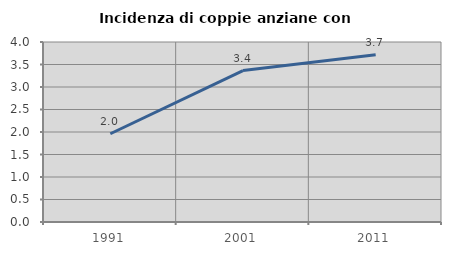
| Category | Incidenza di coppie anziane con figli |
|---|---|
| 1991.0 | 1.962 |
| 2001.0 | 3.366 |
| 2011.0 | 3.717 |